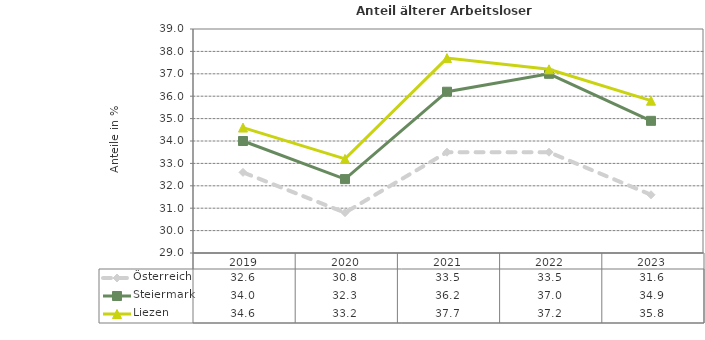
| Category | Österreich | Steiermark | Liezen |
|---|---|---|---|
| 2023.0 | 31.6 | 34.9 | 35.8 |
| 2022.0 | 33.5 | 37 | 37.2 |
| 2021.0 | 33.5 | 36.2 | 37.7 |
| 2020.0 | 30.8 | 32.3 | 33.2 |
| 2019.0 | 32.6 | 34 | 34.6 |